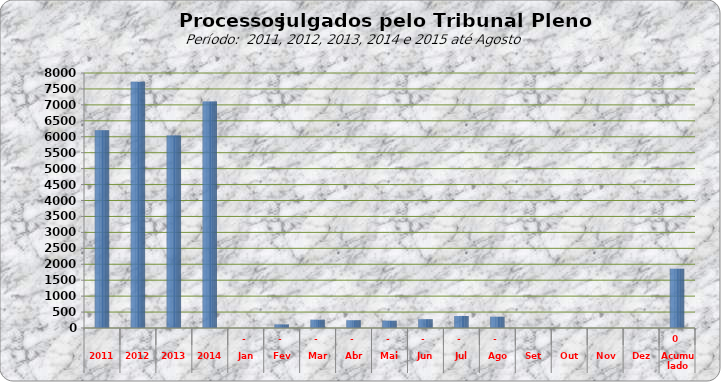
| Category | 6205 7722 6043  7.108  0 113 258 243 231 277 379 354 0 0 0 0 |
|---|---|
| 2011 | 6205 |
| 2012 | 7722 |
| 2013 | 6043 |
| 2014 | 7108 |
| Jan | 0 |
| Fev | 113 |
| Mar | 258 |
| Abr | 243 |
| Mai | 231 |
| Jun | 277 |
| Jul | 379 |
| Ago | 354 |
| Set | 0 |
| Out | 0 |
| Nov | 0 |
| Dez | 0 |
| Acumulado | 1855 |